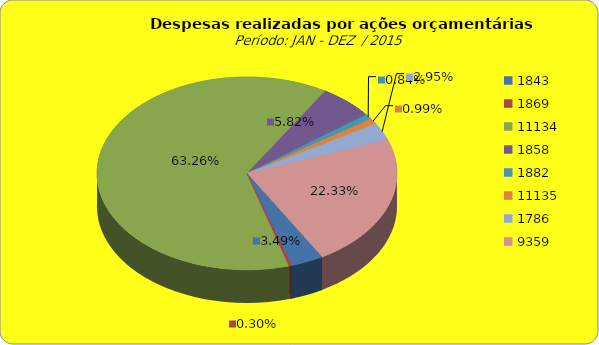
| Category | Series 1 |
|---|---|
| 1843.0 | 7932149.86 |
| 1869.0 | 684272.51 |
| 11134.0 | 143620998.13 |
| 1858.0 | 13224069.98 |
| 1882.0 | 1911132.22 |
| 11135.0 | 2251954.01 |
| 1786.0 | 6701241.98 |
| 9359.0 | 50697762.63 |